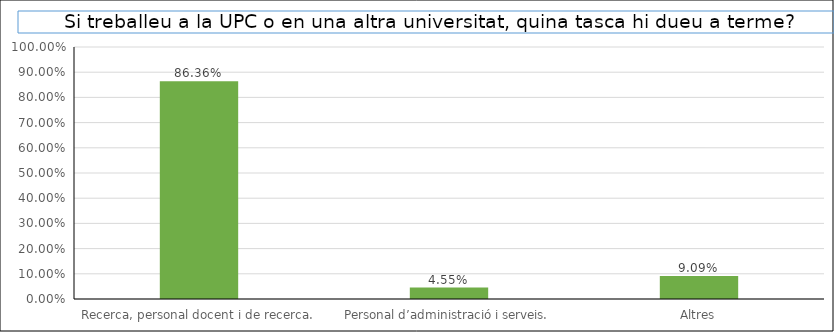
| Category | Series 0 |
|---|---|
| Recerca, personal docent i de recerca. | 0.864 |
| Personal d’administració i serveis. | 0.045 |
| Altres | 0.091 |